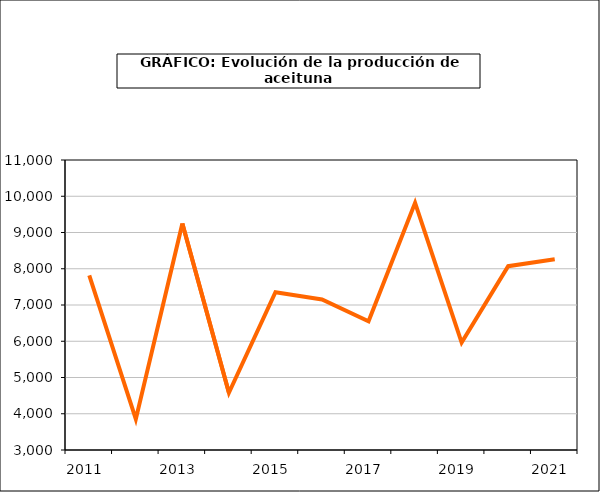
| Category | Series 0 |
|---|---|
| 2011.0 | 7820.06 |
| 2012.0 | 3849.263 |
| 2013.0 | 9250.61 |
| 2014.0 | 4579.208 |
| 2015.0 | 7352.095 |
| 2016.0 | 7154.076 |
| 2017.0 | 6549.499 |
| 2018.0 | 9819.569 |
| 2019.0 | 5965.077 |
| 2020.0 | 8069.983 |
| 2021.0 | 8261.231 |